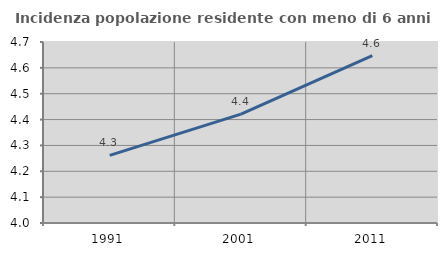
| Category | Incidenza popolazione residente con meno di 6 anni |
|---|---|
| 1991.0 | 4.262 |
| 2001.0 | 4.421 |
| 2011.0 | 4.647 |